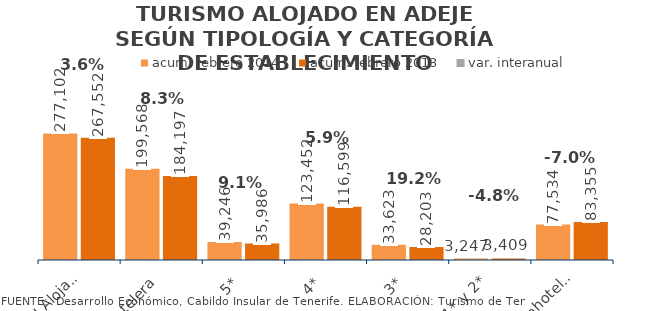
| Category | acum. febrero 2014 | acum. febrero 2013 |
|---|---|---|
| Total Alojados | 277102 | 267552 |
| Hotelera | 199568 | 184197 |
| 5* | 39246 | 35986 |
| 4* | 123452 | 116599 |
| 3* | 33623 | 28203 |
| 1* y 2* | 3247 | 3409 |
| Extrahotelera | 77534 | 83355 |